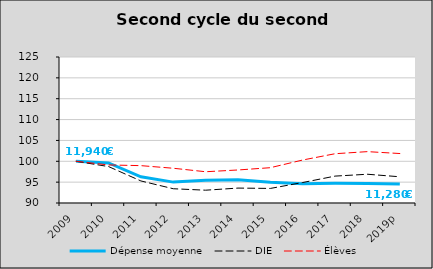
| Category | Dépense moyenne  | DIE  | Élèves |
|---|---|---|---|
| 2009 | 100 | 100 | 100 |
| 2010 | 99.608 | 98.732 | 99.121 |
| 2011 | 96.291 | 95.285 | 98.956 |
| 2012 | 95.007 | 93.419 | 98.329 |
| 2013 | 95.46 | 93.068 | 97.494 |
| 2014 | 95.566 | 93.576 | 97.918 |
| 2015 | 94.952 | 93.494 | 98.464 |
| 2016 | 94.62 | 94.912 | 100.308 |
| 2017 | 94.729 | 96.447 | 101.814 |
| 2018 | 94.703 | 96.894 | 102.314 |
| 2019p | 94.53 | 96.287 | 101.86 |